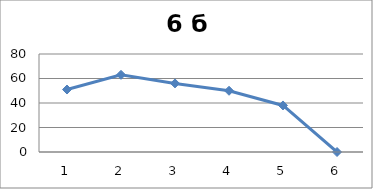
| Category | Series 0 |
|---|---|
| 0 | 51 |
| 1 | 63 |
| 2 | 56 |
| 3 | 50 |
| 4 | 38 |
| 5 | 0 |